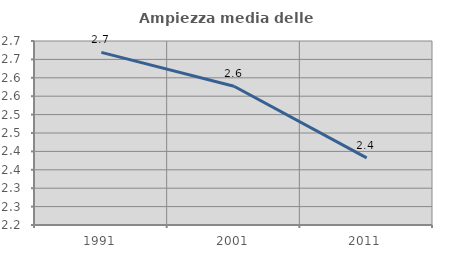
| Category | Ampiezza media delle famiglie |
|---|---|
| 1991.0 | 2.669 |
| 2001.0 | 2.577 |
| 2011.0 | 2.382 |